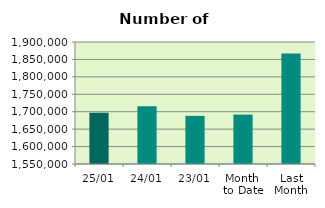
| Category | Series 0 |
|---|---|
| 25/01 | 1696872 |
| 24/01 | 1715652 |
| 23/01 | 1688066 |
| Month 
to Date | 1691729.889 |
| Last
Month | 1866821.895 |